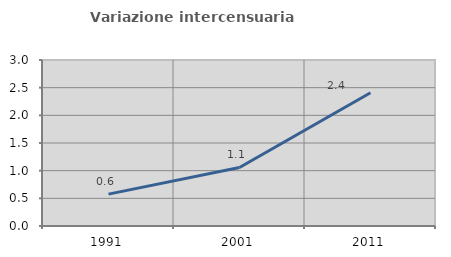
| Category | Variazione intercensuaria annua |
|---|---|
| 1991.0 | 0.576 |
| 2001.0 | 1.058 |
| 2011.0 | 2.408 |